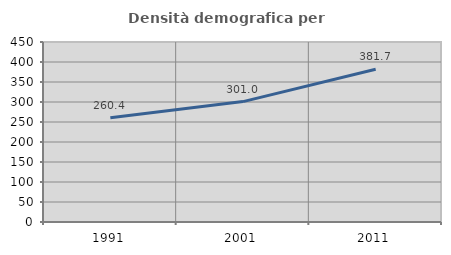
| Category | Densità demografica |
|---|---|
| 1991.0 | 260.356 |
| 2001.0 | 301.003 |
| 2011.0 | 381.72 |